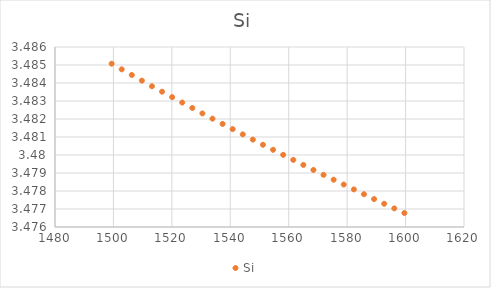
| Category | Si |
|---|---|
| 1499.383911 | 3.485 |
| 1502.834839 | 3.485 |
| 1506.286133 | 3.484 |
| 1509.737671 | 3.484 |
| 1513.189697 | 3.484 |
| 1516.641846 | 3.484 |
| 1520.094482 | 3.483 |
| 1523.547241 | 3.483 |
| 1527.000488 | 3.483 |
| 1530.453979 | 3.482 |
| 1533.907959 | 3.482 |
| 1537.362061 | 3.482 |
| 1540.81665 | 3.481 |
| 1544.271362 | 3.481 |
| 1547.726563 | 3.481 |
| 1551.182007 | 3.481 |
| 1554.637939 | 3.48 |
| 1558.093994 | 3.48 |
| 1561.550537 | 3.48 |
| 1565.007202 | 3.479 |
| 1568.464478 | 3.479 |
| 1571.921875 | 3.479 |
| 1575.379639 | 3.479 |
| 1578.837769 | 3.478 |
| 1582.296265 | 3.478 |
| 1585.755127 | 3.478 |
| 1589.214233 | 3.478 |
| 1592.673706 | 3.477 |
| 1596.133545 | 3.477 |
| 1599.593628 | 3.477 |